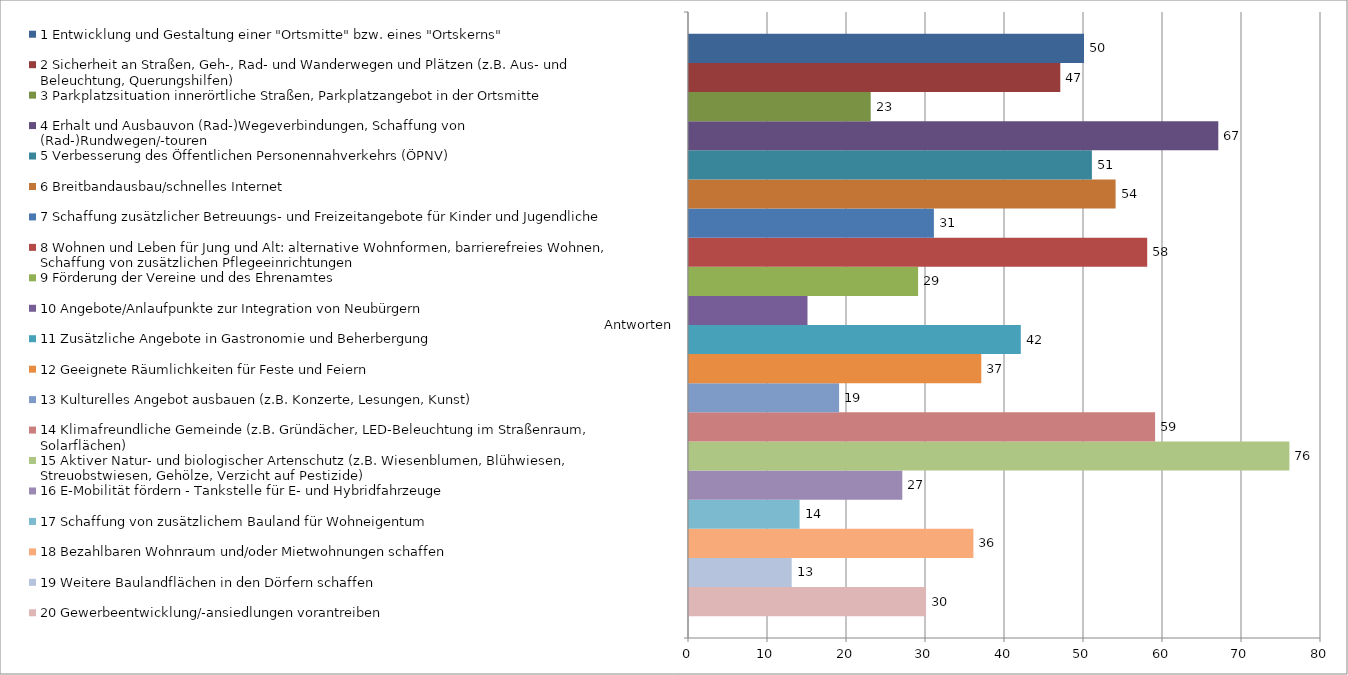
| Category | 20 Gewerbeentwicklung/-ansiedlungen vorantreiben | 19 Weitere Baulandflächen in den Dörfern schaffen | 18 Bezahlbaren Wohnraum und/oder Mietwohnungen schaffen | 17 Schaffung von zusätzlichem Bauland für Wohneigentum | 16 E-Mobilität fördern - Tankstelle für E- und Hybridfahrzeuge | 15 Aktiver Natur- und biologischer Artenschutz (z.B. Wiesenblumen, Blühwiesen, Streuobstwiesen, Gehölze, Verzicht auf Pestizide) | 14 Klimafreundliche Gemeinde (z.B. Gründächer, LED-Beleuchtung im Straßenraum, Solarflächen) | 13 Kulturelles Angebot ausbauen (z.B. Konzerte, Lesungen, Kunst) | 12 Geeignete Räumlichkeiten für Feste und Feiern | 11 Zusätzliche Angebote in Gastronomie und Beherbergung | 10 Angebote/Anlaufpunkte zur Integration von Neubürgern | 9 Förderung der Vereine und des Ehrenamtes | 8 Wohnen und Leben für Jung und Alt: alternative Wohnformen, barrierefreies Wohnen, Schaffung von zusätzlichen Pflegeeinrichtungen | 7 Schaffung zusätzlicher Betreuungs- und Freizeitangebote für Kinder und Jugendliche | 6 Breitbandausbau/schnelles Internet | 5 Verbesserung des Öffentlichen Personennahverkehrs (ÖPNV) | 4 Erhalt und Ausbauvon (Rad-)Wegeverbindungen, Schaffung von (Rad-)Rundwegen/-touren | 3 Parkplatzsituation innerörtliche Straßen, Parkplatzangebot in der Ortsmitte | 2 Sicherheit an Straßen, Geh-, Rad- und Wanderwegen und Plätzen (z.B. Aus- und Beleuchtung, Querungshilfen) | 1 Entwicklung und Gestaltung einer "Ortsmitte" bzw. eines "Ortskerns" |
|---|---|---|---|---|---|---|---|---|---|---|---|---|---|---|---|---|---|---|---|---|
| Antworten | 30 | 13 | 36 | 14 | 27 | 76 | 59 | 19 | 37 | 42 | 15 | 29 | 58 | 31 | 54 | 51 | 67 | 23 | 47 | 50 |